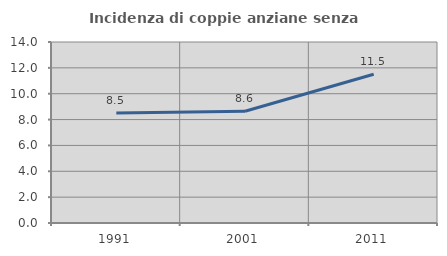
| Category | Incidenza di coppie anziane senza figli  |
|---|---|
| 1991.0 | 8.503 |
| 2001.0 | 8.644 |
| 2011.0 | 11.502 |